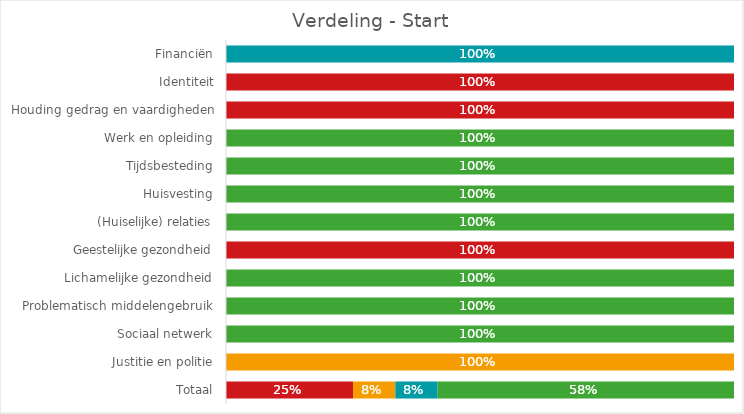
| Category | Series 0 | Series 1 | Series 2 | Series 3 | Series 4 |
|---|---|---|---|---|---|
| Financiën | 0 | 0 | 0 | 1 | 0 |
| Identiteit | 1 | 0 | 0 | 0 | 0 |
| Houding gedrag en vaardigheden | 1 | 0 | 0 | 0 | 0 |
| Werk en opleiding | 0 | 0 | 0 | 0 | 1 |
| Tijdsbesteding | 0 | 0 | 0 | 0 | 1 |
| Huisvesting | 0 | 0 | 0 | 0 | 1 |
| (Huiselijke) relaties | 0 | 0 | 0 | 0 | 1 |
| Geestelijke gezondheid | 1 | 0 | 0 | 0 | 0 |
| Lichamelijke gezondheid | 0 | 0 | 0 | 0 | 1 |
| Problematisch middelengebruik | 0 | 0 | 0 | 0 | 1 |
| Sociaal netwerk | 0 | 0 | 0 | 0 | 1 |
| Justitie en politie | 0 | 0 | 1 | 0 | 0 |
| Totaal | 0.25 | 0 | 0.083 | 0.083 | 0.583 |